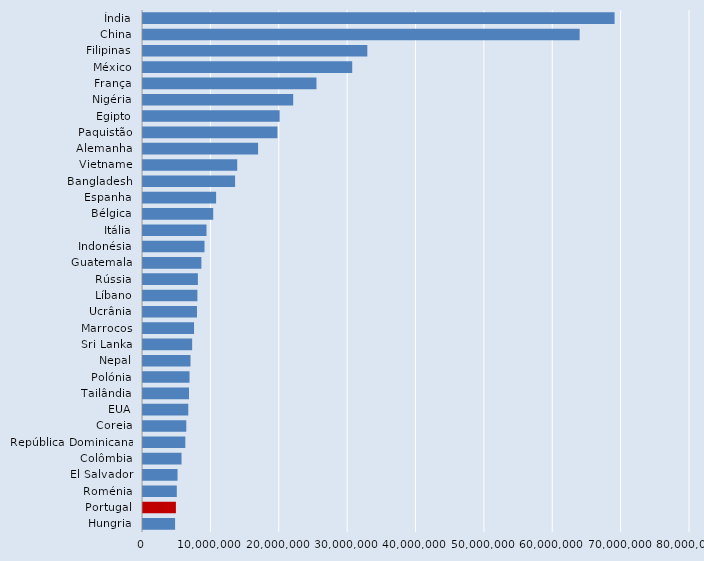
| Category | Series 0 |
|---|---|
| Índia | 68968100 |
| China | 63859748.2 |
| Filipinas | 32807755.147 |
| México | 30600049.726 |
| França | 25372378.812 |
| Nigéria | 21967240.454 |
| Egipto | 19982655.154 |
| Paquistão | 19664599.144 |
| Alemanha | 16833332.177 |
| Vietname | 13780800 |
| Bangladesh | 13469450.822 |
| Espanha | 10692018.954 |
| Bélgica | 10272997.311 |
| Itália | 9287431.404 |
| Indonésia | 8997284.702 |
| Guatemala | 8539810.163 |
| Rússia | 8026312.046 |
| Líbano | 7954715.162 |
| Ucrânia | 7894536.836 |
| Marrocos | 7467193.025 |
| Sri Lanka | 7189867.931 |
| Nepal | 6946529.996 |
| Polónia | 6805296.8 |
| Tailândia | 6728649.885 |
| EUA | 6621000 |
| Coreia | 6331771.304 |
| República Dominicana | 6190504.214 |
| Colômbia | 5636366.916 |
| El Salvador | 5050514.437 |
| Roménia | 4943644.11 |
| Portugal | 4811145.228 |
| Hungria | 4692234.871 |